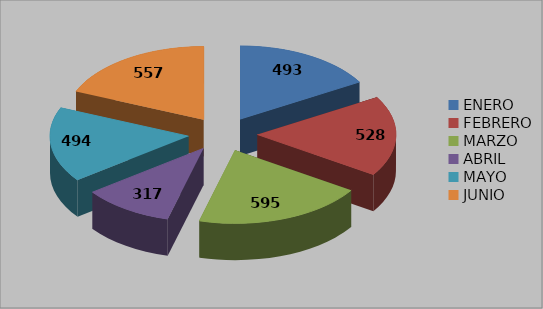
| Category | Series 0 |
|---|---|
| ENERO | 493 |
| FEBRERO | 528 |
| MARZO | 595 |
| ABRIL | 317 |
| MAYO | 494 |
| JUNIO | 557 |